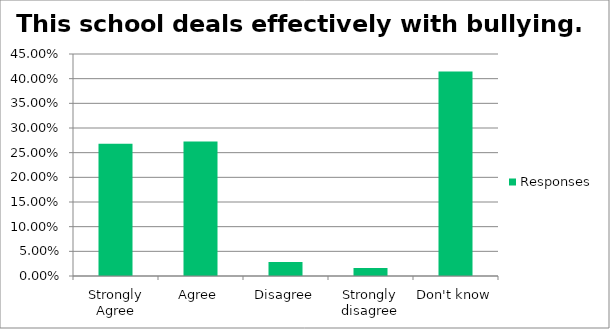
| Category | Responses |
|---|---|
| Strongly Agree | 0.268 |
| Agree | 0.272 |
| Disagree | 0.028 |
| Strongly disagree | 0.016 |
| Don't know | 0.415 |